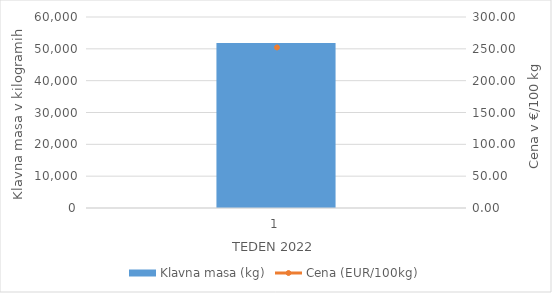
| Category | Klavna masa (kg) |
|---|---|
| 1.0 | 51818 |